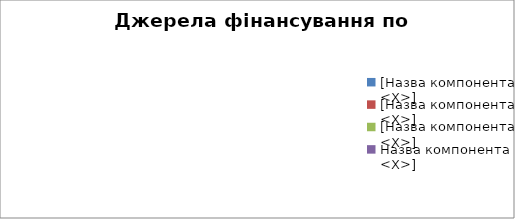
| Category | Разом |
|---|---|
| [Назва компонента <X>] | 0 |
| [Назва компонента <X>] | 0 |
| [Назва компонента <X>] | 0 |
| Назва компонента <X>] | 0 |